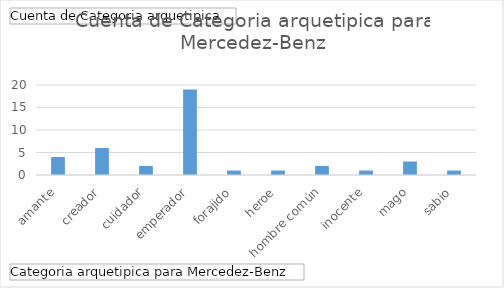
| Category | Total |
|---|---|
| amante | 4 |
| creador | 6 |
| cuidador | 2 |
| emperador | 19 |
| forajido | 1 |
| heroe | 1 |
| hombre común | 2 |
| inocente | 1 |
| mago | 3 |
| sabio | 1 |